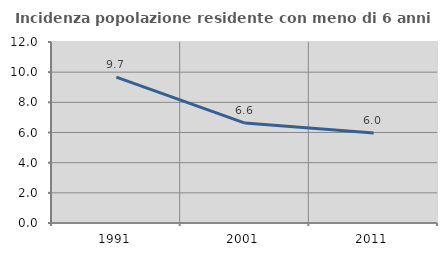
| Category | Incidenza popolazione residente con meno di 6 anni |
|---|---|
| 1991.0 | 9.674 |
| 2001.0 | 6.626 |
| 2011.0 | 5.967 |